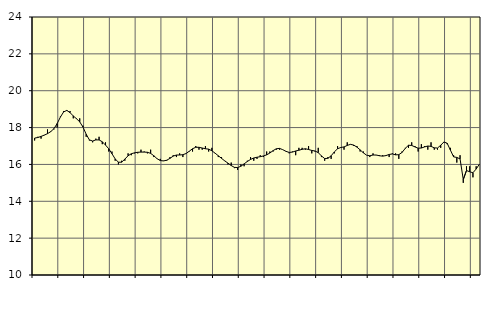
| Category | Piggar | Handel, SNI 45-471 |
|---|---|---|
| nan | 17.3 | 17.43 |
| 87.0 | 17.5 | 17.46 |
| 87.0 | 17.4 | 17.52 |
| 87.0 | 17.6 | 17.59 |
| nan | 17.9 | 17.67 |
| 88.0 | 17.8 | 17.78 |
| 88.0 | 17.9 | 17.94 |
| 88.0 | 18 | 18.22 |
| nan | 18.6 | 18.57 |
| 89.0 | 18.9 | 18.85 |
| 89.0 | 18.9 | 18.93 |
| 89.0 | 18.9 | 18.81 |
| nan | 18.5 | 18.63 |
| 90.0 | 18.5 | 18.48 |
| 90.0 | 18.5 | 18.31 |
| 90.0 | 18.1 | 18.03 |
| nan | 17.5 | 17.64 |
| 91.0 | 17.3 | 17.33 |
| 91.0 | 17.2 | 17.27 |
| 91.0 | 17.4 | 17.33 |
| nan | 17.5 | 17.33 |
| 92.0 | 17.1 | 17.23 |
| 92.0 | 17.2 | 17.05 |
| 92.0 | 16.7 | 16.85 |
| nan | 16.7 | 16.58 |
| 93.0 | 16.2 | 16.3 |
| 93.0 | 16 | 16.12 |
| 93.0 | 16.2 | 16.12 |
| nan | 16.2 | 16.29 |
| 94.0 | 16.6 | 16.47 |
| 94.0 | 16.5 | 16.58 |
| 94.0 | 16.6 | 16.63 |
| nan | 16.6 | 16.66 |
| 95.0 | 16.8 | 16.67 |
| 95.0 | 16.7 | 16.67 |
| 95.0 | 16.6 | 16.66 |
| nan | 16.8 | 16.6 |
| 96.0 | 16.4 | 16.47 |
| 96.0 | 16.3 | 16.31 |
| 96.0 | 16.3 | 16.21 |
| nan | 16.2 | 16.19 |
| 97.0 | 16.2 | 16.23 |
| 97.0 | 16.4 | 16.33 |
| 97.0 | 16.5 | 16.45 |
| nan | 16.4 | 16.51 |
| 98.0 | 16.6 | 16.51 |
| 98.0 | 16.4 | 16.53 |
| 98.0 | 16.6 | 16.59 |
| nan | 16.7 | 16.72 |
| 99.0 | 16.7 | 16.85 |
| 99.0 | 17 | 16.93 |
| 99.0 | 16.8 | 16.93 |
| nan | 16.8 | 16.89 |
| 0.0 | 17 | 16.85 |
| 0.0 | 16.7 | 16.83 |
| 0.0 | 16.9 | 16.74 |
| nan | 16.6 | 16.61 |
| 1.0 | 16.4 | 16.47 |
| 1.0 | 16.4 | 16.33 |
| 1.0 | 16.2 | 16.19 |
| nan | 16 | 16.07 |
| 2.0 | 16.1 | 15.94 |
| 2.0 | 15.8 | 15.84 |
| 2.0 | 15.7 | 15.83 |
| nan | 16 | 15.9 |
| 3.0 | 15.9 | 16.03 |
| 3.0 | 16.2 | 16.16 |
| 3.0 | 16.4 | 16.27 |
| nan | 16.2 | 16.35 |
| 4.0 | 16.3 | 16.39 |
| 4.0 | 16.5 | 16.42 |
| 4.0 | 16.4 | 16.46 |
| nan | 16.7 | 16.52 |
| 5.0 | 16.7 | 16.62 |
| 5.0 | 16.7 | 16.75 |
| 5.0 | 16.8 | 16.85 |
| nan | 16.8 | 16.87 |
| 6.0 | 16.8 | 16.8 |
| 6.0 | 16.7 | 16.71 |
| 6.0 | 16.6 | 16.65 |
| nan | 16.7 | 16.67 |
| 7.0 | 16.5 | 16.73 |
| 7.0 | 16.9 | 16.77 |
| 7.0 | 16.9 | 16.82 |
| nan | 16.8 | 16.85 |
| 8.0 | 17 | 16.81 |
| 8.0 | 16.6 | 16.76 |
| 8.0 | 16.7 | 16.73 |
| nan | 16.9 | 16.64 |
| 9.0 | 16.4 | 16.46 |
| 9.0 | 16.2 | 16.32 |
| 9.0 | 16.4 | 16.33 |
| nan | 16.3 | 16.47 |
| 10.0 | 16.6 | 16.68 |
| 10.0 | 17 | 16.85 |
| 10.0 | 16.9 | 16.92 |
| nan | 16.8 | 16.95 |
| 11.0 | 17.2 | 17.03 |
| 11.0 | 17.1 | 17.09 |
| 11.0 | 17 | 17.05 |
| nan | 17 | 16.94 |
| 12.0 | 16.7 | 16.79 |
| 12.0 | 16.7 | 16.63 |
| 12.0 | 16.5 | 16.5 |
| nan | 16.4 | 16.47 |
| 13.0 | 16.6 | 16.51 |
| 13.0 | 16.5 | 16.51 |
| 13.0 | 16.5 | 16.47 |
| nan | 16.5 | 16.45 |
| 14.0 | 16.5 | 16.48 |
| 14.0 | 16.4 | 16.54 |
| 14.0 | 16.6 | 16.57 |
| nan | 16.6 | 16.52 |
| 15.0 | 16.3 | 16.53 |
| 15.0 | 16.7 | 16.65 |
| 15.0 | 16.9 | 16.87 |
| nan | 16.9 | 17.04 |
| 16.0 | 17.2 | 17.03 |
| 16.0 | 17 | 16.95 |
| 16.0 | 16.7 | 16.88 |
| nan | 17.1 | 16.89 |
| 17.0 | 17 | 16.95 |
| 17.0 | 16.8 | 17 |
| 17.0 | 17.2 | 16.98 |
| nan | 16.8 | 16.9 |
| 18.0 | 16.8 | 16.89 |
| 18.0 | 16.9 | 17.04 |
| 18.0 | 17.2 | 17.22 |
| nan | 17.1 | 17.15 |
| 19.0 | 16.9 | 16.78 |
| 19.0 | 16.5 | 16.41 |
| 19.0 | 16.1 | 16.38 |
| nan | 16.5 | 16.3 |
| 20.0 | 15 | 15.18 |
| 20.0 | 15.9 | 15.67 |
| 20.0 | 15.9 | 15.6 |
| nan | 15.3 | 15.55 |
| 21.0 | 15.9 | 15.75 |
| 21.0 | 16 | 16.01 |